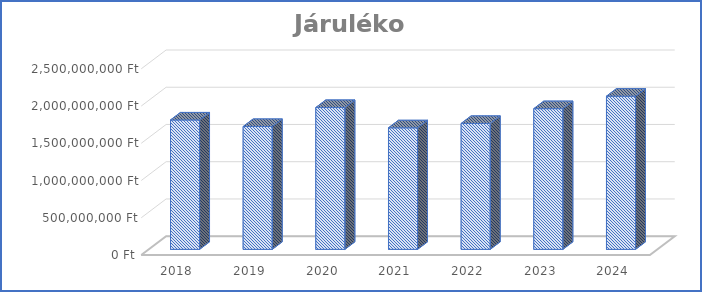
| Category | Járulékok |
|---|---|
| 2018.0 | 1737290781 |
| 2019.0 | 1649561332 |
| 2020.0 | 1904446184 |
| 2021.0 | 1632139718 |
| 2022.0 | 1690644768 |
| 2023.0 | 1889212622 |
| 2024.0 | 2056505950 |